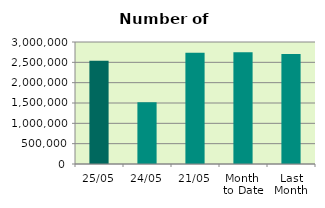
| Category | Series 0 |
|---|---|
| 25/05 | 2536472 |
| 24/05 | 1515464 |
| 21/05 | 2737942 |
| Month 
to Date | 2750529.294 |
| Last
Month | 2707305.9 |